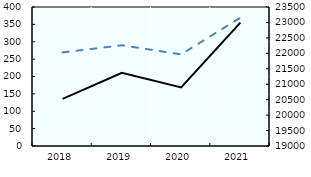
| Category | IS |
|---|---|
| 2018.0 | 269.279 |
| 2019.0 | 289.89 |
| 2020.0 | 263.763 |
| 2021.0 | 369.144 |